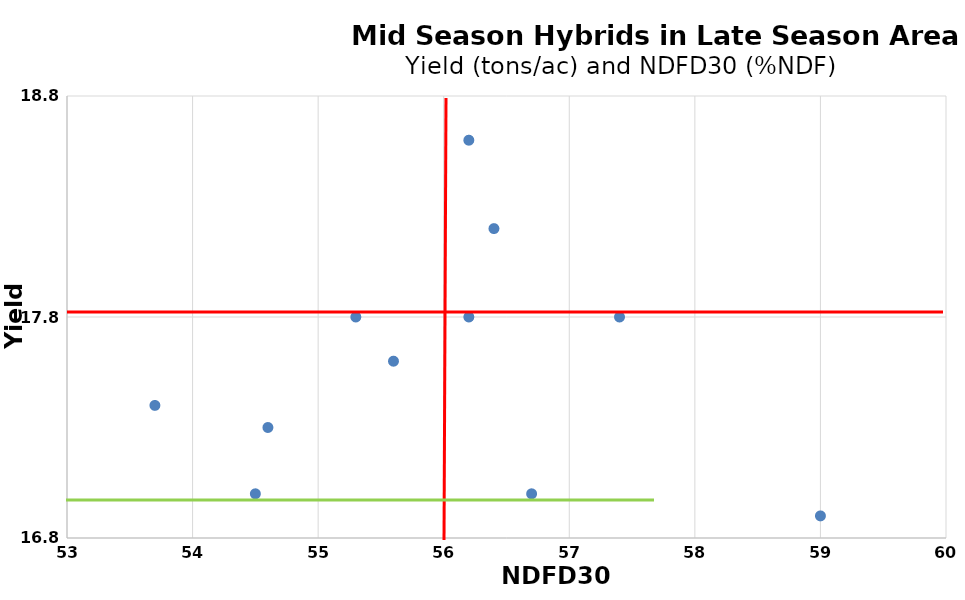
| Category | Series 0 |
|---|---|
| 56.2 | 18.6 |
| 56.4 | 18.2 |
| 54.6 | 17.3 |
| 54.5 | 17 |
| 53.7 | 17.4 |
| 59.0 | 16.9 |
| 56.2 | 17.8 |
| 57.4 | 17.8 |
| 56.7 | 17 |
| 55.6 | 17.6 |
| 55.3 | 17.8 |